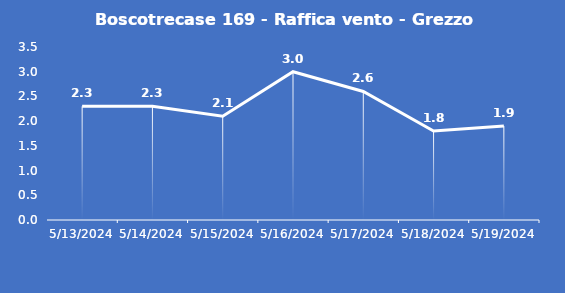
| Category | Boscotrecase 169 - Raffica vento - Grezzo (m/s) |
|---|---|
| 5/13/24 | 2.3 |
| 5/14/24 | 2.3 |
| 5/15/24 | 2.1 |
| 5/16/24 | 3 |
| 5/17/24 | 2.6 |
| 5/18/24 | 1.8 |
| 5/19/24 | 1.9 |